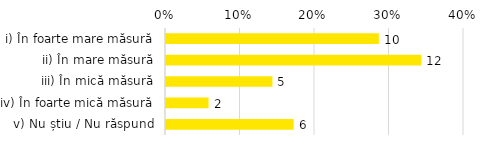
| Category | Total |
|---|---|
| i) În foarte mare măsură | 0.286 |
| ii) În mare măsură | 0.343 |
| iii) În mică măsură | 0.143 |
| iv) În foarte mică măsură | 0.057 |
| v) Nu știu / Nu răspund | 0.171 |